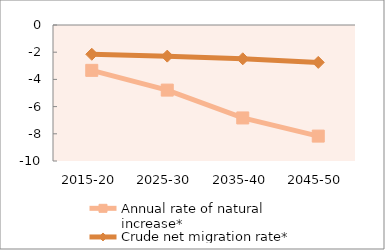
| Category | Annual rate of natural increase* | Crude net migration rate* |
|---|---|---|
| 2015-20 | -3.335 | -2.151 |
| 2025-30 | -4.787 | -2.289 |
| 2035-40 | -6.834 | -2.484 |
| 2045-50 | -8.169 | -2.75 |